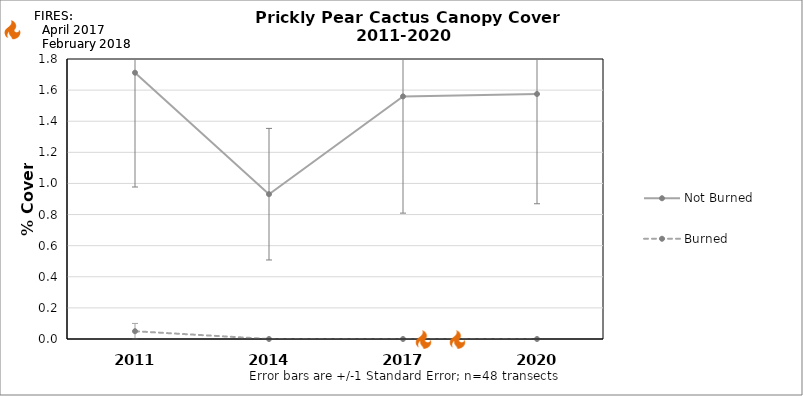
| Category | Not Burned | Burned |
|---|---|---|
| 2011.0 | 1.712 | 0.05 |
| 2014.0 | 0.931 | 0 |
| 2017.0 | 1.56 | 0 |
| 2020.0 | 1.575 | 0 |